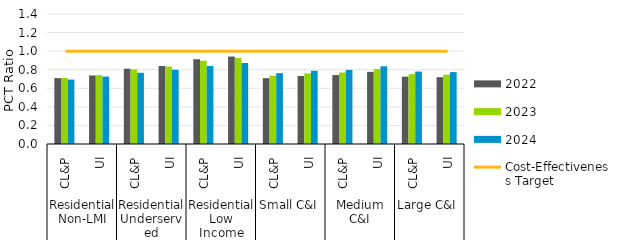
| Category | 2022 | 2023 | 2024 |
|---|---|---|---|
| 0 | 0.709 | 0.711 | 0.694 |
| 1 | 0.738 | 0.742 | 0.726 |
| 2 | 0.811 | 0.804 | 0.767 |
| 3 | 0.84 | 0.834 | 0.799 |
| 4 | 0.913 | 0.896 | 0.84 |
| 5 | 0.942 | 0.927 | 0.873 |
| 6 | 0.709 | 0.736 | 0.763 |
| 7 | 0.732 | 0.76 | 0.789 |
| 8 | 0.742 | 0.77 | 0.798 |
| 9 | 0.777 | 0.806 | 0.837 |
| 10 | 0.725 | 0.752 | 0.78 |
| 11 | 0.72 | 0.746 | 0.774 |